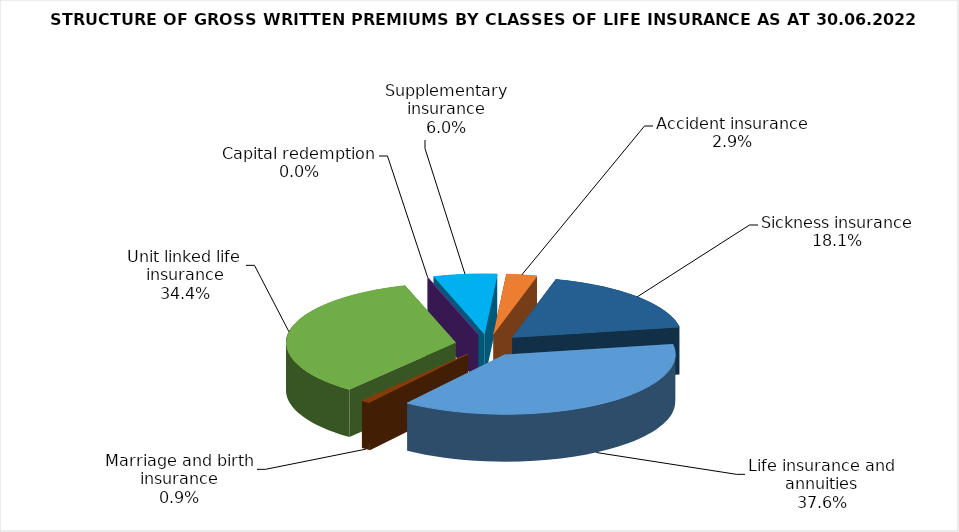
| Category | Life insurance and annuities |
|---|---|
| Life insurance and annuities | 120093999.333 |
| Marriage and birth insurance | 2976524.53 |
| Unit linked life insurance | 109915314.491 |
| Capital redemption | 0 |
| Supplementary insurance | 19240639.522 |
| Accident insurance | 9308342.93 |
| Sickness insurance | 57793525.22 |